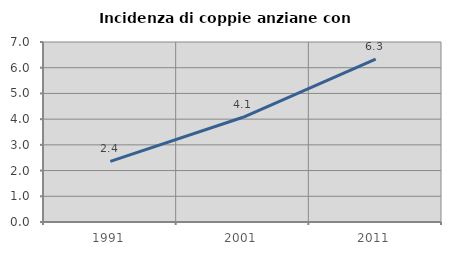
| Category | Incidenza di coppie anziane con figli |
|---|---|
| 1991.0 | 2.358 |
| 2001.0 | 4.072 |
| 2011.0 | 6.335 |